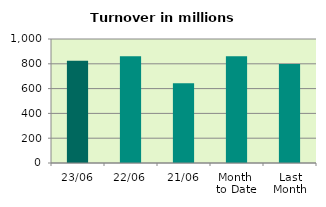
| Category | Series 0 |
|---|---|
| 23/06 | 824.12 |
| 22/06 | 861.054 |
| 21/06 | 643.557 |
| Month 
to Date | 861.413 |
| Last
Month | 798.504 |